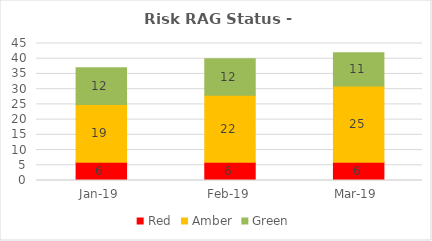
| Category | Red | Amber | Green |
|---|---|---|---|
| 2019-01-01 | 6 | 19 | 12 |
| 2019-02-01 | 6 | 22 | 12 |
| 2019-03-01 | 6 | 25 | 11 |